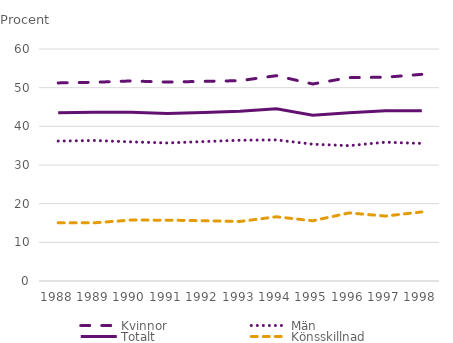
| Category | Kvinnor | Män | Totalt | Könsskillnad |
|---|---|---|---|---|
| 1988.0 | 51.231 | 36.191 | 43.484 | 15.04 |
| 1989.0 | 51.395 | 36.339 | 43.655 | 15.056 |
| 1990.0 | 51.737 | 35.984 | 43.637 | 15.753 |
| 1991.0 | 51.438 | 35.704 | 43.319 | 15.734 |
| 1992.0 | 51.638 | 36.059 | 43.607 | 15.579 |
| 1993.0 | 51.807 | 36.407 | 43.898 | 15.4 |
| 1994.0 | 53.102 | 36.493 | 44.559 | 16.609 |
| 1995.0 | 50.955 | 35.374 | 42.874 | 15.58 |
| 1996.0 | 52.6 | 35 | 43.5 | 17.6 |
| 1997.0 | 52.7 | 35.9 | 44 | 16.8 |
| 1998.0 | 53.443 | 35.573 | 44.019 | 17.87 |